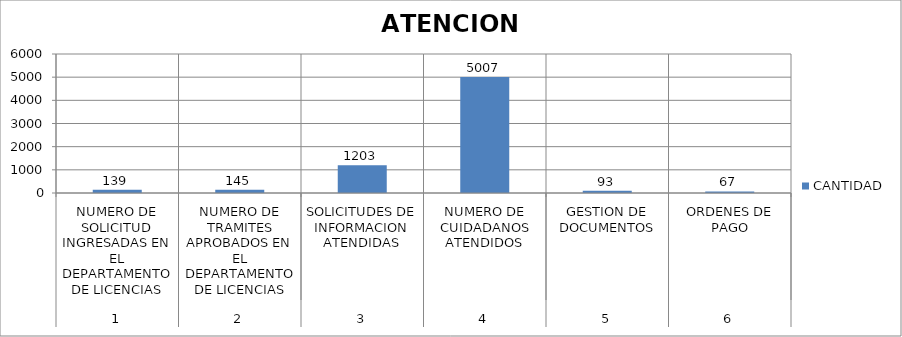
| Category | CANTIDAD |
|---|---|
| 0 | 139 |
| 1 | 145 |
| 2 | 1203 |
| 3 | 5007 |
| 4 | 93 |
| 5 | 67 |